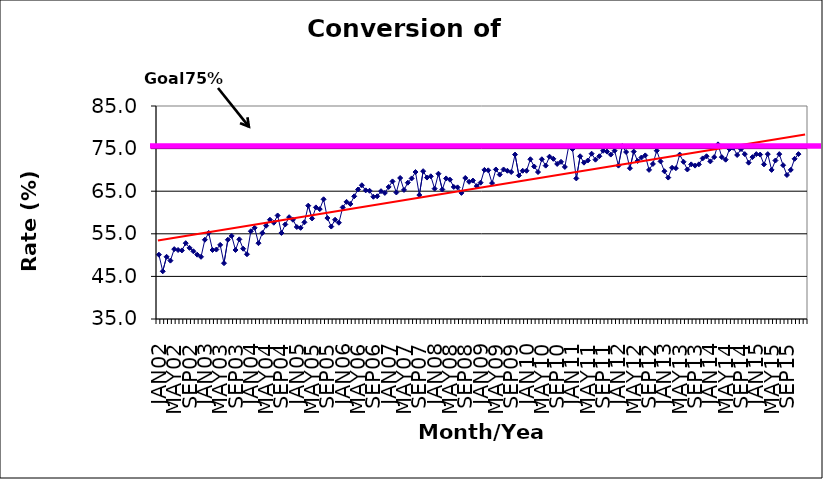
| Category | Series 0 |
|---|---|
| JAN02 | 50.1 |
| FEB02 | 46.2 |
| MAR02 | 49.6 |
| APR02 | 48.7 |
| MAY02 | 51.4 |
| JUN02 | 51.2 |
| JUL02 | 51.1 |
| AUG02 | 52.8 |
| SEP02 | 51.7 |
| OCT02 | 50.9 |
| NOV02 | 50.1 |
| DEC02 | 49.6 |
| JAN03 | 53.6 |
| FEB03 | 55.2 |
| MAR03 | 51.2 |
| APR03 | 51.3 |
| MAY03 | 52.4 |
| JUN03 | 48.1 |
| JUL03 | 53.6 |
| AUG03 | 54.5 |
| SEP03 | 51.2 |
| OCT03 | 53.7 |
| NOV03 | 51.5 |
| DEC03 | 50.2 |
| JAN04 | 55.6 |
| FEB04 | 56.4 |
| MAR04 | 52.8 |
| APR04 | 55.2 |
| MAY04 | 56.9 |
| JUN04 | 58.3 |
| JUL04 | 57.6 |
| AUG04 | 59.3 |
| SEP04 | 55.2 |
| OCT04 | 57.2 |
| NOV04 | 58.9 |
| DEC04 | 58.3 |
| JAN05 | 56.6 |
| FEB05 | 56.4 |
| MAR05 | 57.7 |
| APR05 | 61.6 |
| MAY05 | 58.6 |
| JUN05 | 61.2 |
| JUL05 | 60.8 |
| AUG05 | 63.1 |
| SEP05 | 58.7 |
| OCT05 | 56.7 |
| NOV05 | 58.3 |
| DEC05 | 57.6 |
| JAN06 | 61.2 |
| FEB06 | 62.5 |
| MAR06 | 62 |
| APR06 | 63.8 |
| MAY06 | 65.4 |
| JUN06 | 66.4 |
| JUL06 | 65.2 |
| AUG06 | 65.1 |
| SEP06 | 63.7 |
| OCT06 | 63.8 |
| NOV06 | 65 |
| DEC06 | 64.6 |
| JAN07 | 66 |
| FEB07 | 67.3 |
| MAR07 | 64.7 |
| APR07 | 68.1 |
| MAY07 | 65.3 |
| JUN07 | 67 |
| JUL07 | 68 |
| AUG07 | 69.5 |
| SEP07 | 64.1 |
| OCT07 | 69.7 |
| NOV07 | 68.2 |
| DEC07 | 68.5 |
| JAN08 | 65.6 |
| FEB08 | 69.1 |
| MAR08 | 65.4 |
| APR08 | 68 |
| MAY08 | 67.7 |
| JUN08 | 66 |
| JUL08 | 65.9 |
| AUG08 | 64.6 |
| SEP08 | 68.1 |
| OCT08 | 67.2 |
| NOV08 | 67.5 |
| DEC08 | 66.2 |
| JAN09 | 67 |
| FEB09 | 70 |
| MAR09 | 69.9 |
| APR09 | 66.9 |
| MAY09 | 70.1 |
| JUN09 | 68.9 |
| JUL09 | 70.1 |
| AUG09 | 69.8 |
| SEP09 | 69.5 |
| OCT09 | 73.6 |
| NOV09 | 68.7 |
| DEC09 | 69.8 |
| JAN10 | 69.8 |
| FEB10 | 72.5 |
| MAR10 | 70.8 |
| APR10 | 69.5 |
| MAY10 | 72.5 |
| JUN10 | 71 |
| JUL10 | 73.1 |
| AUG10 | 72.6 |
| SEP10 | 71.4 |
| OCT10 | 71.9 |
| NOV10 | 70.7 |
| DEC10 | 75.5 |
| JAN11 | 74.9 |
| FEB11 | 68 |
| MAR11 | 73.2 |
| APR11 | 71.7 |
| MAY11 | 72.2 |
| JUN11 | 73.8 |
| JUL11 | 72.4 |
| AUG11 | 73.2 |
| SEP11 | 74.5 |
| OCT11 | 74.3 |
| NOV11 | 73.6 |
| DEC11 | 74.5 |
| JAN12 | 71 |
| FEB12 | 75.6 |
| MAR12 | 74.2 |
| APR12 | 70.4 |
| MAY12 | 74.3 |
| JUN12 | 72.1 |
| JUL12 | 72.9 |
| AUG12 | 73.4 |
| SEP12 | 70 |
| OCT12 | 71.4 |
| NOV12 | 74.5 |
| DEC12 | 72 |
| JAN13 | 69.7 |
| FEB13 | 68.2 |
| MAR13 | 70.5 |
| APR13 | 70.4 |
| MAY13 | 73.6 |
| JUN13 | 71.9 |
| JUL13 | 70.1 |
| AUG13 | 71.3 |
| SEP13 | 71 |
| OCT13 | 71.3 |
| NOV13 | 72.7 |
| DEC13 | 73.2 |
| JAN14 | 72 |
| FEB14 | 73 |
| MAR14 | 76 |
| APR14 | 73 |
| MAY14 | 72.4 |
| JUN14 | 74.9 |
| JUL14 | 75.2 |
| AUG14 | 73.5 |
| SEP14 | 74.9 |
| OCT14 | 73.7 |
| NOV14 | 71.7 |
| DEC14 | 73 |
| JAN15 | 73.7 |
| FEB15 | 73.6 |
| MAR15 | 71.3 |
| APR15 | 73.7 |
| MAY15 | 70 |
| JUN15 | 72.2 |
| JUL15 | 73.7 |
| AUG15 | 71.1 |
| SEP15 | 68.8 |
| OCT15 | 70 |
| NOV15 | 72.6 |
| DEC15 | 73.7 |